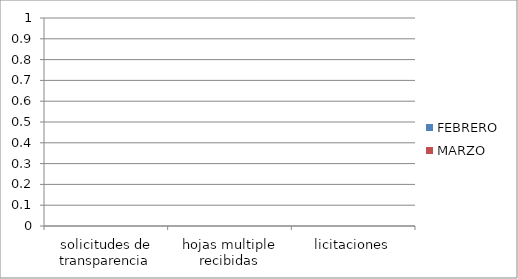
| Category | FEBRERO | MARZO |
|---|---|---|
| solicitudes de transparencia | 0 | 0 |
| hojas multiple recibidas | 0 | 0 |
| licitaciones | 0 | 0 |